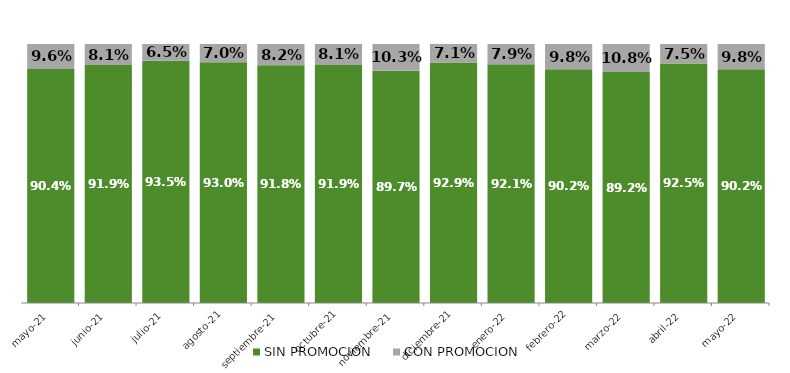
| Category | SIN PROMOCION   | CON PROMOCION   |
|---|---|---|
| 2021-05-01 | 0.904 | 0.096 |
| 2021-06-01 | 0.919 | 0.081 |
| 2021-07-01 | 0.935 | 0.065 |
| 2021-08-01 | 0.93 | 0.07 |
| 2021-09-01 | 0.918 | 0.082 |
| 2021-10-01 | 0.919 | 0.081 |
| 2021-11-01 | 0.897 | 0.103 |
| 2021-12-01 | 0.929 | 0.071 |
| 2022-01-01 | 0.921 | 0.079 |
| 2022-02-01 | 0.902 | 0.098 |
| 2022-03-01 | 0.892 | 0.108 |
| 2022-04-01 | 0.925 | 0.075 |
| 2022-05-01 | 0.902 | 0.098 |